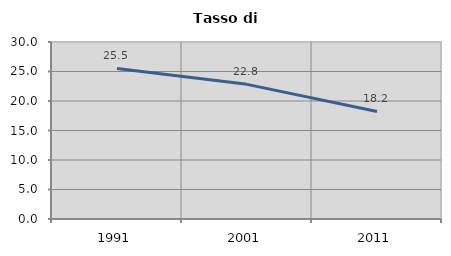
| Category | Tasso di disoccupazione   |
|---|---|
| 1991.0 | 25.526 |
| 2001.0 | 22.823 |
| 2011.0 | 18.234 |